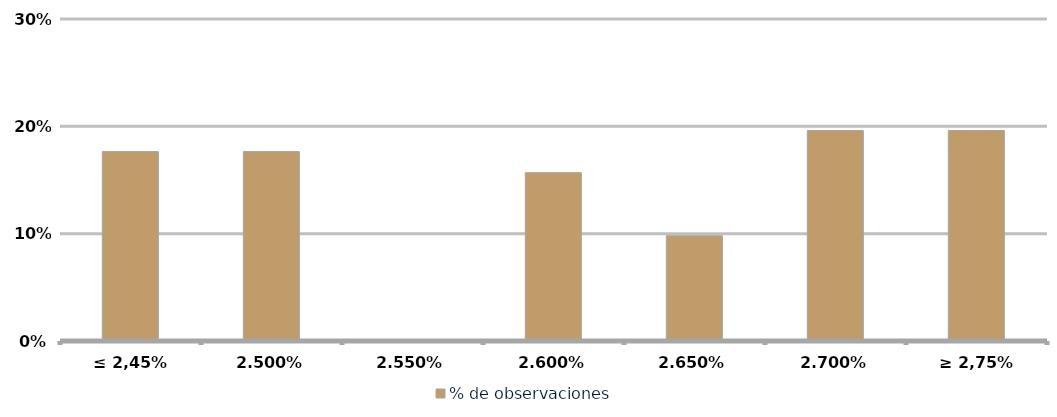
| Category | % de observaciones  |
|---|---|
| ≤ 2,45% | 0.176 |
| 2,50% | 0.176 |
| 2,55% | 0 |
| 2,60% | 0.157 |
| 2,65% | 0.098 |
| 2,70% | 0.196 |
| ≥ 2,75% | 0.196 |